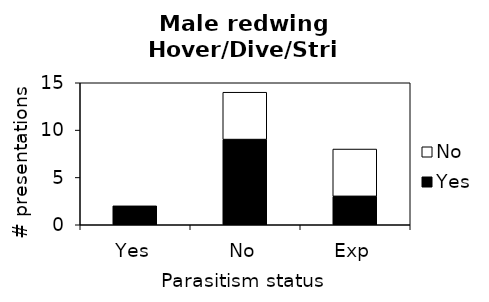
| Category | Yes | No |
|---|---|---|
| Yes | 2 | 0 |
| No | 9 | 5 |
| Exp | 3 | 5 |